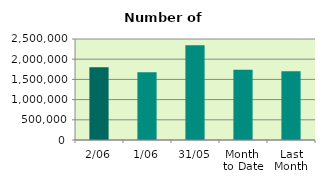
| Category | Series 0 |
|---|---|
| 2/06 | 1799440 |
| 1/06 | 1676414 |
| 31/05 | 2347074 |
| Month 
to Date | 1737927 |
| Last
Month | 1704183.636 |